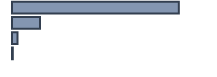
| Category | Series 0 |
|---|---|
| 0 | 83 |
| 1 | 13.9 |
| 2 | 2.7 |
| 3 | 0.4 |